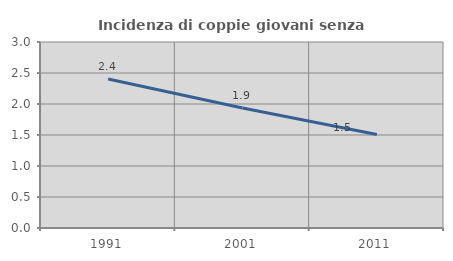
| Category | Incidenza di coppie giovani senza figli |
|---|---|
| 1991.0 | 2.403 |
| 2001.0 | 1.935 |
| 2011.0 | 1.509 |